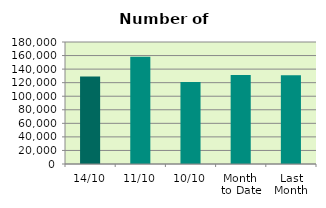
| Category | Series 0 |
|---|---|
| 14/10 | 129026 |
| 11/10 | 158386 |
| 10/10 | 121100 |
| Month 
to Date | 131232.4 |
| Last
Month | 130923.048 |